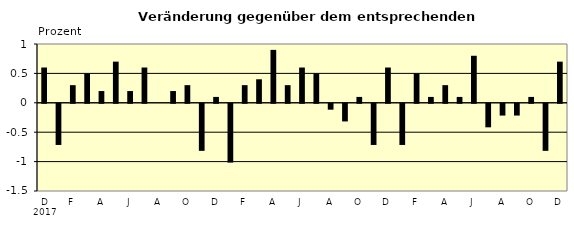
| Category | Series 0 |
|---|---|
| 0 | 0.6 |
| 1 | -0.7 |
| 2 | 0.3 |
| 3 | 0.5 |
| 4 | 0.2 |
| 5 | 0.7 |
| 6 | 0.2 |
| 7 | 0.6 |
| 8 | 0 |
| 9 | 0.2 |
| 10 | 0.3 |
| 11 | -0.8 |
| 12 | 0.1 |
| 13 | -1 |
| 14 | 0.3 |
| 15 | 0.4 |
| 16 | 0.9 |
| 17 | 0.3 |
| 18 | 0.6 |
| 19 | 0.5 |
| 20 | -0.1 |
| 21 | -0.3 |
| 22 | 0.1 |
| 23 | -0.7 |
| 24 | 0.6 |
| 25 | -0.7 |
| 26 | 0.5 |
| 27 | 0.1 |
| 28 | 0.3 |
| 29 | 0.1 |
| 30 | 0.8 |
| 31 | -0.4 |
| 32 | -0.2 |
| 33 | -0.2 |
| 34 | 0.1 |
| 35 | -0.8 |
| 36 | 0.7 |